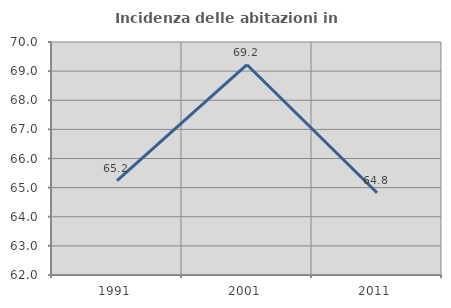
| Category | Incidenza delle abitazioni in proprietà  |
|---|---|
| 1991.0 | 65.242 |
| 2001.0 | 69.22 |
| 2011.0 | 64.822 |